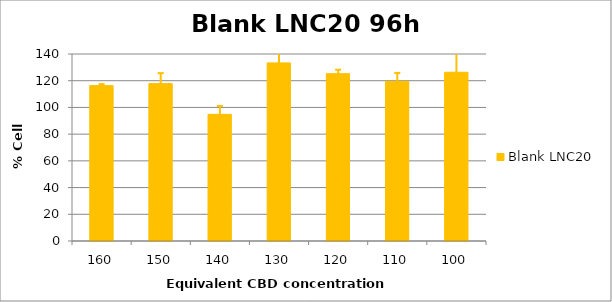
| Category | Blank LNC20 |
|---|---|
| 160.0 | 116.348 |
| 150.0 | 117.833 |
| 140.0 | 94.818 |
| 130.0 | 133.323 |
| 120.0 | 125.287 |
| 110.0 | 119.521 |
| 100.0 | 126.327 |